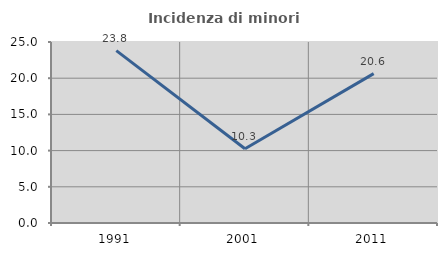
| Category | Incidenza di minori stranieri |
|---|---|
| 1991.0 | 23.81 |
| 2001.0 | 10.256 |
| 2011.0 | 20.635 |